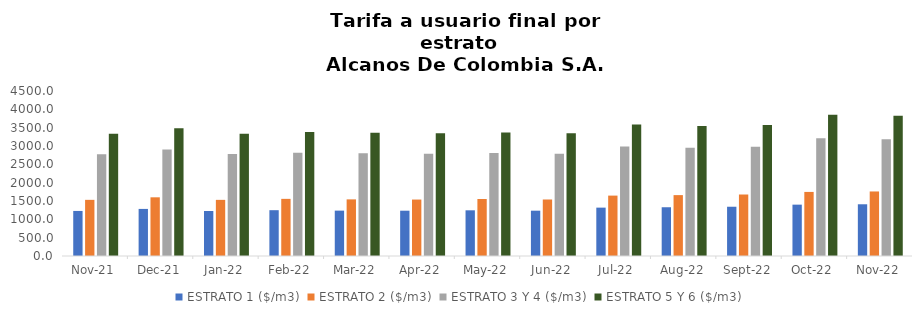
| Category | ESTRATO 1 ($/m3) | ESTRATO 2 ($/m3) | ESTRATO 3 Y 4 ($/m3) | ESTRATO 5 Y 6 ($/m3) |
|---|---|---|---|---|
| 2021-11-01 | 1228.85 | 1531.43 | 2775.81 | 3330.972 |
| 2021-12-01 | 1284.14 | 1600.54 | 2902.39 | 3482.868 |
| 2022-01-01 | 1226.59 | 1530.96 | 2778.76 | 3334.512 |
| 2022-02-01 | 1249.45 | 1558.47 | 2818.77 | 3382.524 |
| 2022-03-01 | 1237.5 | 1544.26 | 2801.57 | 3361.884 |
| 2022-04-01 | 1235.41 | 1539.57 | 2791.83 | 3350.196 |
| 2022-05-01 | 1246.07 | 1555.19 | 2808.77 | 3370.524 |
| 2022-06-01 | 1235.97 | 1541.14 | 2787.21 | 3344.652 |
| 2022-07-01 | 1319.23 | 1647.13 | 2986.65 | 3583.98 |
| 2022-08-01 | 1329.81 | 1660.43 | 2951.9 | 3542.28 |
| 2022-09-01 | 1343.51 | 1677.21 | 2979.32 | 3575.184 |
| 2022-10-01 | 1400.59 | 1747.53 | 3208.12 | 3849.744 |
| 2022-11-01 | 1410.78 | 1760.08 | 3185.9 | 3823.08 |